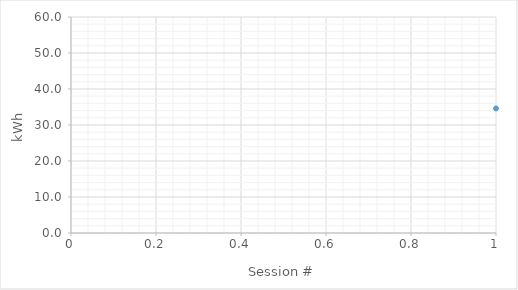
| Category | Series 0 |
|---|---|
| 0 | 34.6 |
| 1 | 45.72 |
| 2 | 44.543 |
| 3 | 39.464 |
| 4 | 43.781 |
| 5 | 44.472 |
| 6 | 43.38 |
| 7 | 49.029 |
| 8 | 24.78 |
| 9 | 16.615 |
| 10 | 22.725 |
| 11 | 42.831 |
| 12 | 45.764 |
| 13 | 29.4 |
| 14 | 27.923 |
| 15 | 15.6 |
| 16 | 44.087 |
| 17 | 44.435 |
| 18 | 45.7 |
| 19 | 32.4 |
| 20 | 45.853 |
| 21 | 44.726 |
| 22 | 44.286 |
| 23 | 43.914 |
| 24 | 37.2 |
| 25 | 30.867 |
| 26 | 44.79 |
| 27 | 37.394 |
| 28 | 34.74 |
| 29 | 17.28 |
| 30 | 33.831 |
| 31 | 31.889 |
| 32 | 30.621 |
| 33 | 42.867 |
| 34 | 19.988 |
| 35 | 22.171 |
| 36 | 24.84 |
| 37 | 13.125 |
| 38 | 40.2 |
| 39 | 25.714 |